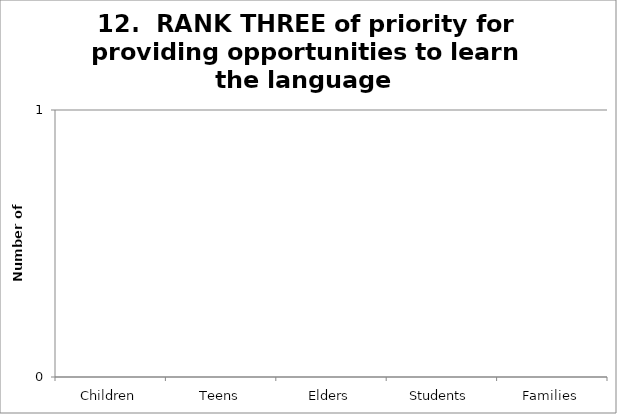
| Category | 12.  RANK THREE of priority for providing opportunities to learn the language  |
|---|---|
| Children | 0 |
| Teens | 0 |
| Elders | 0 |
| Students | 0 |
| Families | 0 |